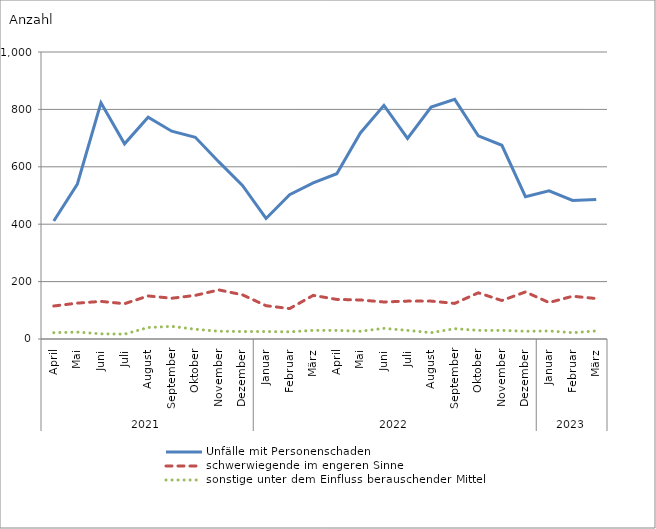
| Category | Unfälle mit Personenschaden | schwerwiegende im engeren Sinne | sonstige unter dem Einfluss berauschender Mittel |
|---|---|---|---|
| 0 | 411 | 115 | 22 |
| 1 | 540 | 125 | 24 |
| 2 | 823 | 131 | 18 |
| 3 | 680 | 123 | 17 |
| 4 | 773 | 150 | 40 |
| 5 | 724 | 142 | 44 |
| 6 | 703 | 152 | 34 |
| 7 | 617 | 171 | 27 |
| 8 | 535 | 154 | 26 |
| 9 | 420 | 116 | 26 |
| 10 | 503 | 106 | 25 |
| 11 | 544 | 152 | 30 |
| 12 | 576 | 138 | 30 |
| 13 | 718 | 136 | 27 |
| 14 | 814 | 129 | 37 |
| 15 | 699 | 132 | 30 |
| 16 | 808 | 132 | 22 |
| 17 | 835 | 124 | 36 |
| 18 | 708 | 161 | 30 |
| 19 | 675 | 134 | 30 |
| 20 | 496 | 164 | 27 |
| 21 | 516 | 127 | 28 |
| 22 | 483 | 149 | 22 |
| 23 | 486 | 141 | 28 |